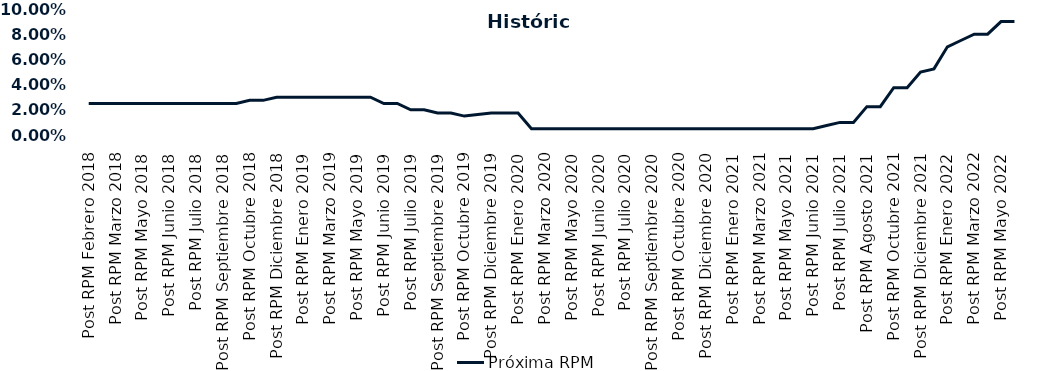
| Category | Próxima RPM |
|---|---|
| Post RPM Febrero 2018 | 0.025 |
| Pre RPM Marzo 2018 | 0.025 |
| Post RPM Marzo 2018 | 0.025 |
| Pre RPM Mayo 2018 | 0.025 |
| Post RPM Mayo 2018 | 0.025 |
| Pre RPM Junio 2018 | 0.025 |
| Post RPM Junio 2018 | 0.025 |
| Pre RPM Julio 2018 | 0.025 |
| Post RPM Julio 2018 | 0.025 |
| Pre RPM Septiembre 2018 | 0.025 |
| Post RPM Septiembre 2018 | 0.025 |
| Pre RPM Octubre 2018 | 0.025 |
| Post RPM Octubre 2018 | 0.028 |
| Pre RPM Diciembre 2018 | 0.028 |
| Post RPM Diciembre 2018 | 0.03 |
| Pre RPM Enero 2019 | 0.03 |
| Post RPM Enero 2019 | 0.03 |
| Pre RPM Marzo 2019 | 0.03 |
| Post RPM Marzo 2019 | 0.03 |
| Pre RPM Mayo 2019 | 0.03 |
| Post RPM Mayo 2019 | 0.03 |
| Pre RPM Junio 2019 | 0.03 |
| Post RPM Junio 2019 | 0.025 |
| Pre RPM Julio 2019 | 0.025 |
| Post RPM Julio 2019 | 0.02 |
| Pre RPM Septiembre 2019 | 0.02 |
| Post RPM Septiembre 2019 | 0.018 |
| Pre RPM Octubre 2019 | 0.018 |
| Post RPM Octubre 2019 | 0.015 |
| Pre RPM Diciembre 2019 | 0.016 |
| Post RPM Diciembre 2019 | 0.018 |
| Pre RPM Enero 2020 | 0.018 |
| Post RPM Enero 2020 | 0.018 |
| Pre RPM Marzo 2020 | 0.005 |
| Post RPM Marzo 2020 | 0.005 |
| Pre RPM Mayo 2020 | 0.005 |
| Post RPM Mayo 2020 | 0.005 |
| Pre RPM Junio 2020 | 0.005 |
| Post RPM Junio 2020 | 0.005 |
| Pre RPM Julio 2020 | 0.005 |
| Post RPM Julio 2020 | 0.005 |
| Pre RPM Septiembre 2020 | 0.005 |
| Post RPM Septiembre 2020 | 0.005 |
| Pre RPM Octubre 2020 | 0.005 |
| Post RPM Octubre 2020 | 0.005 |
| Pre RPM Diciembre 2020 | 0.005 |
| Post RPM Diciembre 2020 | 0.005 |
| Pre RPM Enero 2021 | 0.005 |
| Post RPM Enero 2021 | 0.005 |
| Pre RPM Marzo 2021 | 0.005 |
| Post RPM Marzo 2021 | 0.005 |
| Pre RPM Mayo 2021 | 0.005 |
| Post RPM Mayo 2021 | 0.005 |
| Pre RPM Junio 2021 | 0.005 |
| Post RPM Junio 2021 | 0.005 |
| Pre RPM Julio 2021 | 0.008 |
| Post RPM Julio 2021 | 0.01 |
| Pre RPM Agosto 2021 | 0.01 |
| Post RPM Agosto 2021 | 0.022 |
| Pre RPM Octubre 2021 | 0.022 |
| Post RPM Octubre 2021 | 0.038 |
| Pre RPM Diciembre 2021 | 0.038 |
| Post RPM Diciembre 2021 | 0.05 |
| Pre RPM Enero 2022 | 0.052 |
| Post RPM Enero 2022 | 0.07 |
| Pre RPM Marzo 2022 | 0.075 |
| Post RPM Marzo 2022 | 0.08 |
| Pre RPM Mayo 2022 | 0.08 |
| Post RPM Mayo 2022 | 0.09 |
| Pre RPM Junio 2022 | 0.09 |